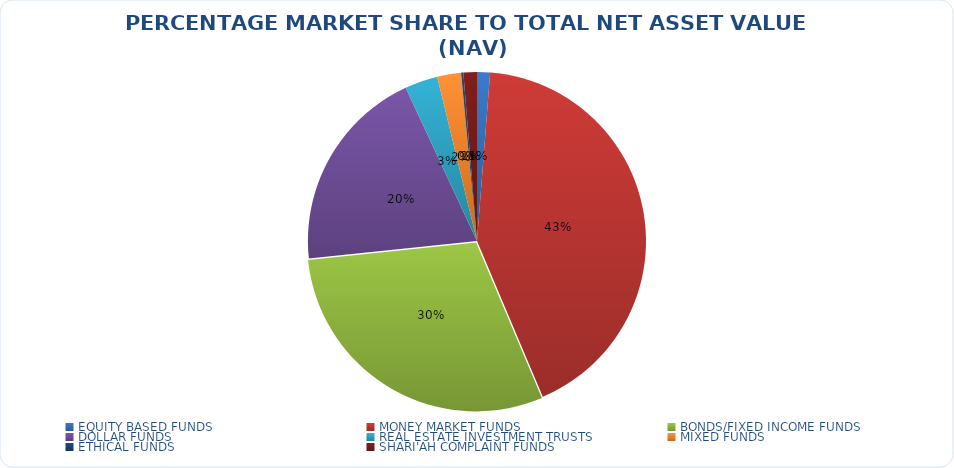
| Category | NET ASSET VALUE |
|---|---|
| EQUITY BASED FUNDS | 17826756747.1 |
| MONEY MARKET FUNDS | 609716601002.418 |
| BONDS/FIXED INCOME FUNDS | 427193365726.9 |
| DOLLAR FUNDS | 283728506822.049 |
| REAL ESTATE INVESTMENT TRUSTS | 45255168131.49 |
| MIXED FUNDS | 32787759032.011 |
| ETHICAL FUNDS | 3089725862.5 |
| SHARI'AH COMPLAINT FUNDS | 18549267222.37 |